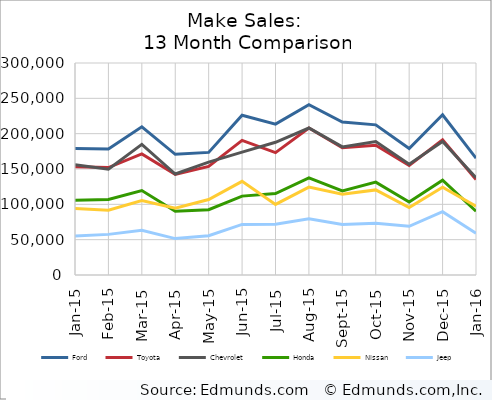
| Category | Ford | Toyota | Chevrolet | Honda | Nissan | Jeep |
|---|---|---|---|---|---|---|
| 2015-01-01 | 179014 | 153043 | 155965 | 105745 | 94072 | 55198 |
| 2015-02-01 | 178221 | 151967 | 149673 | 106957 | 91790 | 57489 |
| 2015-03-01 | 209679 | 171361 | 184938 | 119472 | 105311 | 63274 |
| 2015-04-01 | 170822 | 142373 | 142882 | 90202 | 94449 | 51523 |
| 2015-05-01 | 173509 | 153608 | 159788 | 92474 | 106777 | 55642 |
| 2015-06-01 | 226091 | 190481 | 173886 | 111623 | 132560 | 71584 |
| 2015-07-01 | 213518 | 173144 | 187837 | 115194 | 99869 | 71759 |
| 2015-08-01 | 240912 | 208102 | 207970 | 137551 | 124305 | 79652 |
| 2015-09-01 | 216355 | 179953 | 181256 | 118870 | 114243 | 71529 |
| 2015-10-01 | 212478 | 183500 | 188790 | 131409 | 120439 | 73216 |
| 2015-11-01 | 178971 | 154994 | 156907 | 103197 | 95389 | 68903 |
| 2015-12-01 | 226746 | 191457 | 188794 | 134070 | 124207 | 89654 |
| 2016-01-01 | 165301 | 135251 | 137803 | 90247 | 97220 | 59032 |